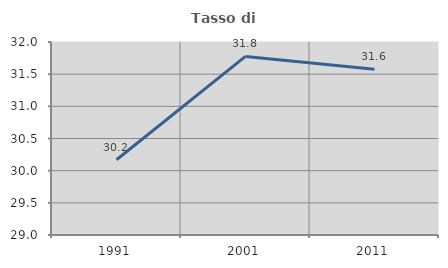
| Category | Tasso di occupazione   |
|---|---|
| 1991.0 | 30.17 |
| 2001.0 | 31.776 |
| 2011.0 | 31.576 |